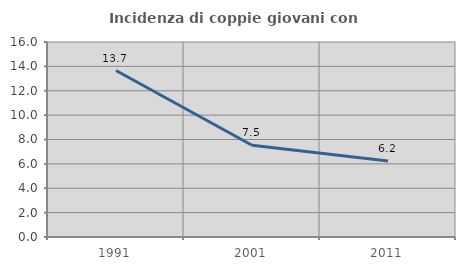
| Category | Incidenza di coppie giovani con figli |
|---|---|
| 1991.0 | 13.661 |
| 2001.0 | 7.527 |
| 2011.0 | 6.233 |